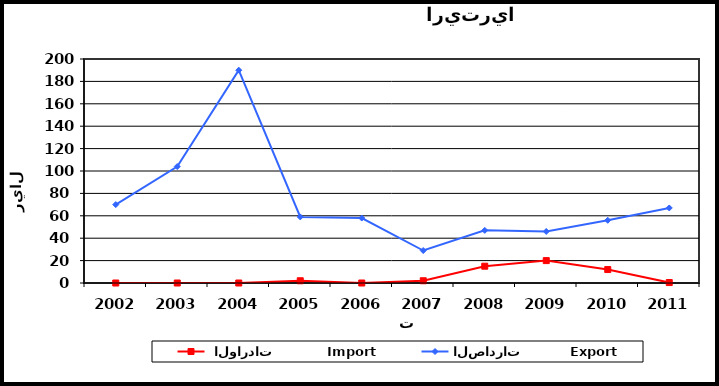
| Category |  الواردات           Import | الصادرات          Export |
|---|---|---|
| 2002.0 | 0 | 70 |
| 2003.0 | 0 | 104 |
| 2004.0 | 0 | 190 |
| 2005.0 | 2 | 59 |
| 2006.0 | 0 | 58 |
| 2007.0 | 2 | 29 |
| 2008.0 | 15 | 47 |
| 2009.0 | 20 | 46 |
| 2010.0 | 12 | 56 |
| 2011.0 | 0.4 | 67 |